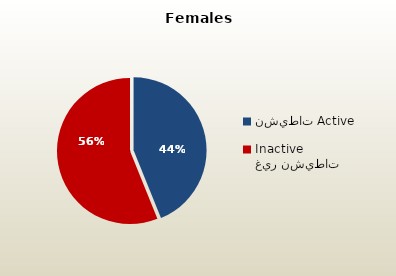
| Category | الاناث القطريات  Qatari Females |
|---|---|
| نشيطات Active | 51636 |
| غير نشيطات Inactive | 66048 |